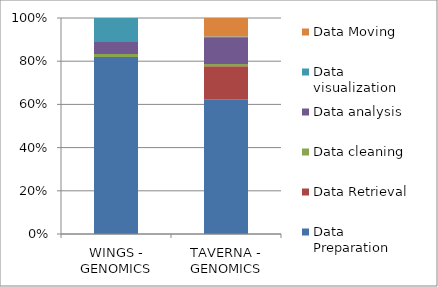
| Category | Data Preparation | Data Retrieval | Data cleaning | Data analysis | Data visualization | Data Moving |
|---|---|---|---|---|---|---|
| WINGS - GENOMICS | 59 | 0 | 1 | 4 | 8 | 0 |
| TAVERNA - GENOMICS | 249 | 61 | 4 | 48 | 3 | 34 |